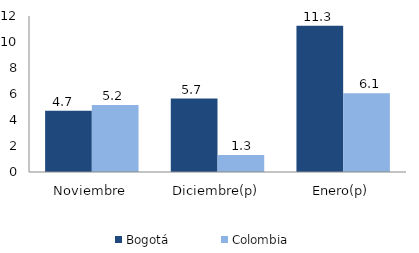
| Category | Bogotá | Colombia |
|---|---|---|
| Noviembre | 4.713 | 5.161 |
| Diciembre(p) | 5.653 | 1.312 |
| Enero(p) | 11.251 | 6.054 |